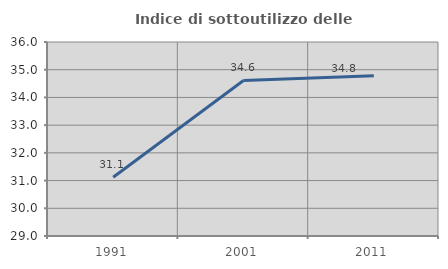
| Category | Indice di sottoutilizzo delle abitazioni  |
|---|---|
| 1991.0 | 31.122 |
| 2001.0 | 34.612 |
| 2011.0 | 34.781 |